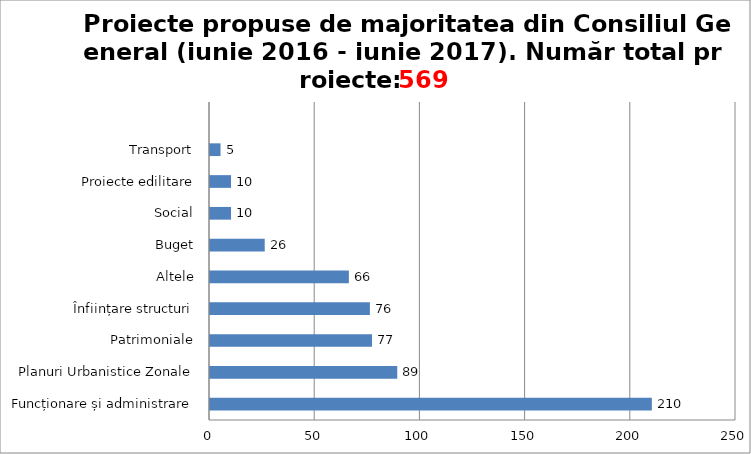
| Category | Series 0 |
|---|---|
| Funcționare și administrare | 210 |
| Planuri Urbanistice Zonale | 89 |
| Patrimoniale | 77 |
| Înființare structuri | 76 |
| Altele | 66 |
| Buget | 26 |
| Social | 10 |
| Proiecte edilitare | 10 |
| Transport | 5 |